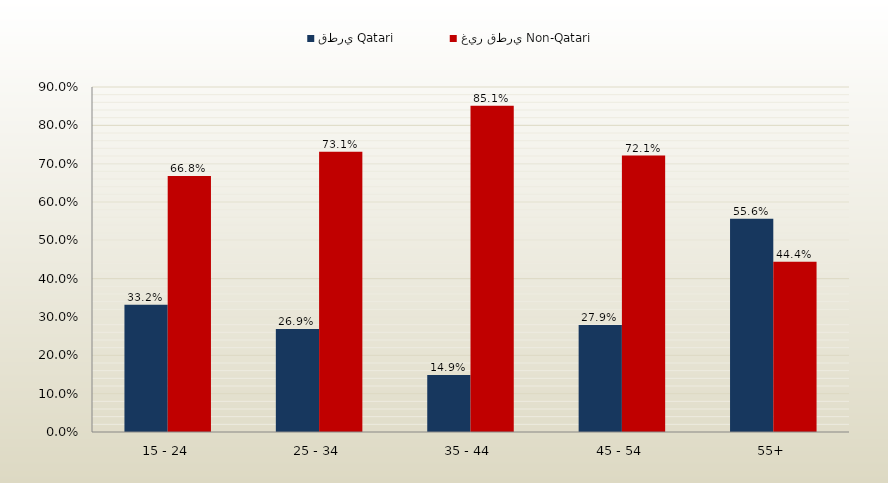
| Category | قطري Qatari | غير قطري Non-Qatari |
|---|---|---|
| 15 - 24 | 0.332 | 0.668 |
| 25 - 34 | 0.269 | 0.731 |
| 35 - 44 | 0.149 | 0.851 |
| 45 - 54 | 0.279 | 0.721 |
| 55+ | 0.556 | 0.444 |